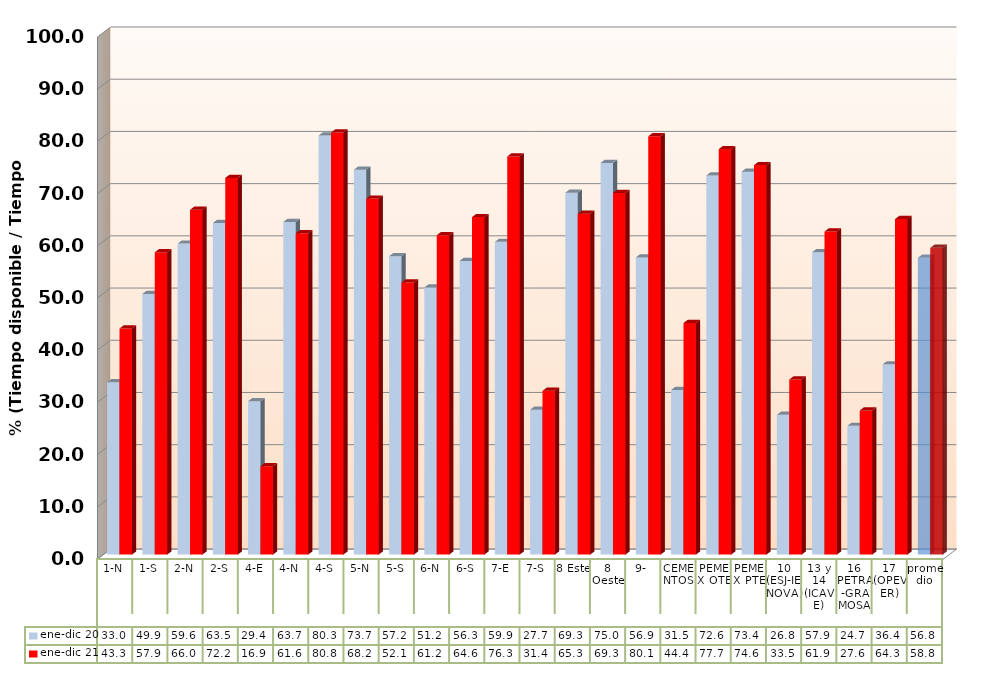
| Category | ene-dic 20 | ene-dic 21 |
|---|---|---|
| 1-N | 33.013 | 43.311 |
| 1-S | 49.928 | 57.904 |
| 2-N | 59.57 | 66.036 |
| 2-S | 63.521 | 72.155 |
| 4-E | 29.389 | 16.94 |
| 4-N | 63.717 | 61.551 |
| 4-S | 80.272 | 80.845 |
| 5-N | 73.704 | 68.186 |
| 5-S | 57.156 | 52.117 |
| 6-N | 51.169 | 61.174 |
| 6-S | 56.258 | 64.641 |
| 7-E | 59.898 | 76.264 |
| 7-S | 27.747 | 31.368 |
| 8 Este | 69.317 | 65.286 |
| 8 Oeste | 75.028 | 69.268 |
| 9- | 56.922 | 80.119 |
| CEMENTOS | 31.53 | 44.351 |
| PEMEX OTE | 72.621 | 77.664 |
| PEMEX PTE | 73.352 | 74.599 |
| 10 (ESJ-IENOVA) | 26.783 | 33.536 |
| 13 y 14 (ICAVE) | 57.92 | 61.884 |
| 16 PETRA-GRAMOSA | 24.66 | 27.618 |
| 17 (OPEVER) | 36.438 | 64.265 |
| promedio | 56.841 | 58.757 |